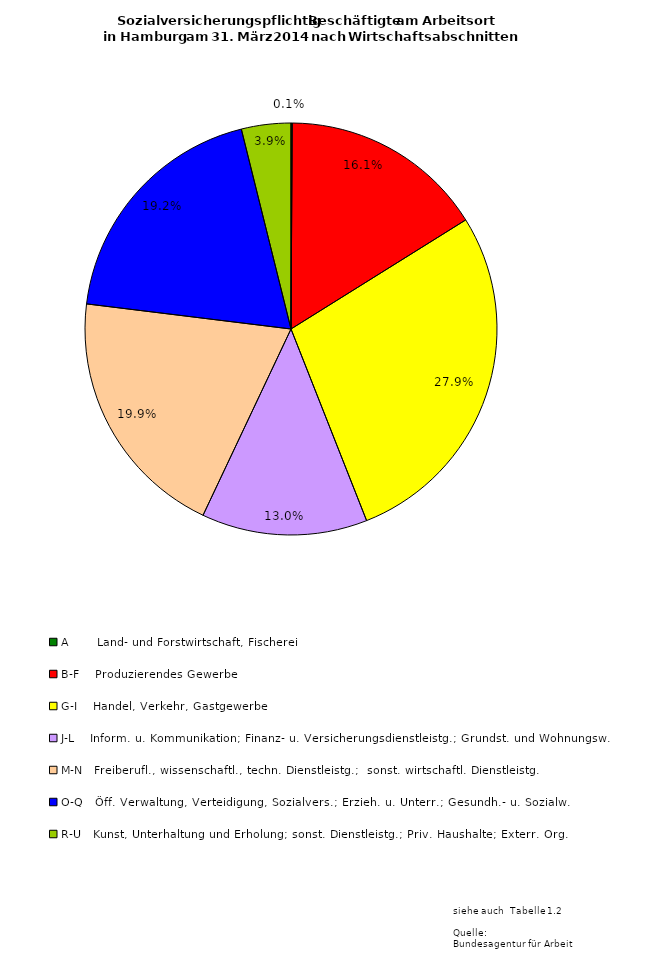
| Category | Series 0 | Series 1 | Series 2 |
|---|---|---|---|
| A       Land- und Forstwirtschaft, Fischerei | 834 | 254 | 580 |
| B-F    Produzierendes Gewerbe | 142410 | 30626 | 111784 |
| G-I    Handel, Verkehr, Gastgewerbe | 247947 | 104114 | 143833 |
| J-L    Inform. u. Kommunikation; Finanz- u. Versicherungsdienstleistg.; Grundst. und Wohnungsw. | 115569 | 51904 | 63665 |
| M-N   Freiberufl., wissenschaftl., techn. Dienstleistg.;  sonst. wirtschaftl. Dienstleistg.  | 177060 | 86947 | 90113 |
| O-Q   Öff. Verwaltung, Verteidigung, Sozialvers.; Erzieh. u. Unterr.; Gesundh.- u. Sozialw. | 170423 | 120066 | 50357 |
| R-U   Kunst, Unterhaltung und Erholung; sonst. Dienstleistg.; Priv. Haushalte; Exterr. Org. | 34462 | 20850 | 13612 |